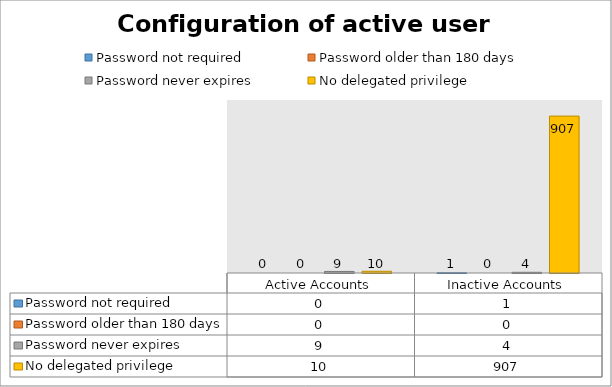
| Category | Password not required | Password older than 180 days | Password never expires | No delegated privilege |
|---|---|---|---|---|
| Active Accounts | 0 | 0 | 9 | 10 |
| Inactive Accounts | 1 | 0 | 4 | 907 |